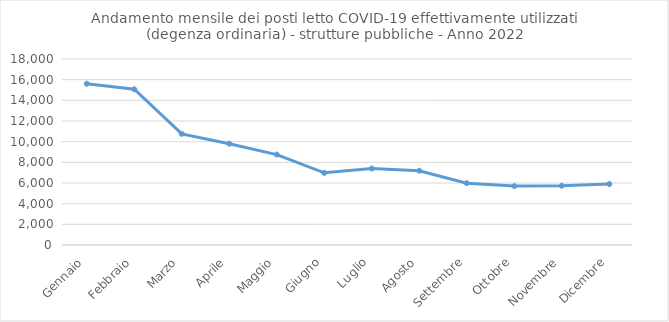
| Category | Posti letto degenza ordinaria COVID-19 (Anno 2022) |
|---|---|
| Gennaio | 15608 |
| Febbraio | 15072 |
| Marzo | 10755 |
| Aprile | 9803 |
| Maggio | 8751 |
| Giugno | 6983 |
| Luglio | 7398 |
| Agosto | 7188 |
| Settembre | 5985 |
| Ottobre | 5701 |
| Novembre | 5736 |
| Dicembre | 5897 |